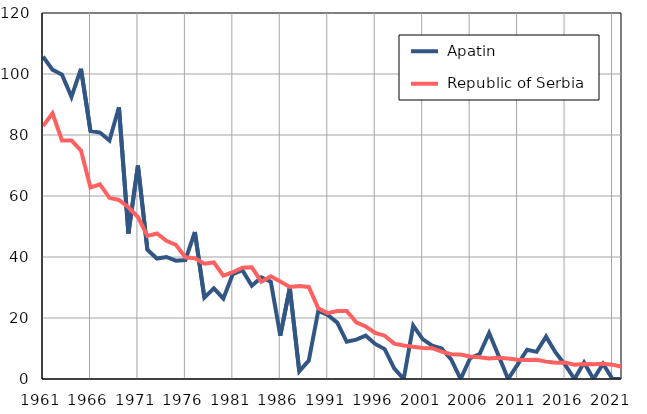
| Category |  Apatin |  Republic of Serbia |
|---|---|---|
| 1961.0 | 105.7 | 82.9 |
| 1962.0 | 101.4 | 87.1 |
| 1963.0 | 99.8 | 78.2 |
| 1964.0 | 92.5 | 78.2 |
| 1965.0 | 101.7 | 74.9 |
| 1966.0 | 81.3 | 62.8 |
| 1967.0 | 80.8 | 63.8 |
| 1968.0 | 78.2 | 59.4 |
| 1969.0 | 89.1 | 58.7 |
| 1970.0 | 47.7 | 56.3 |
| 1971.0 | 70 | 53.1 |
| 1972.0 | 42.4 | 46.9 |
| 1973.0 | 39.5 | 47.7 |
| 1974.0 | 40 | 45.3 |
| 1975.0 | 38.8 | 44 |
| 1976.0 | 39 | 39.9 |
| 1977.0 | 48.2 | 39.6 |
| 1978.0 | 26.7 | 37.8 |
| 1979.0 | 29.7 | 38.2 |
| 1980.0 | 26.4 | 33.9 |
| 1981.0 | 34.4 | 35 |
| 1982.0 | 35.7 | 36.5 |
| 1983.0 | 30.6 | 36.6 |
| 1984.0 | 33.3 | 31.9 |
| 1985.0 | 31.9 | 33.7 |
| 1986.0 | 14.2 | 32 |
| 1987.0 | 29.9 | 30.2 |
| 1988.0 | 2.5 | 30.5 |
| 1989.0 | 6 | 30.2 |
| 1990.0 | 22.3 | 23.2 |
| 1991.0 | 21 | 21.6 |
| 1992.0 | 18.5 | 22.3 |
| 1993.0 | 12.2 | 22.3 |
| 1994.0 | 12.9 | 18.6 |
| 1995.0 | 14.2 | 17.2 |
| 1996.0 | 11.5 | 15.1 |
| 1997.0 | 9.8 | 14.2 |
| 1998.0 | 3.5 | 11.6 |
| 1999.0 | 0 | 11 |
| 2000.0 | 17.5 | 10.6 |
| 2001.0 | 13.1 | 10.2 |
| 2002.0 | 10.9 | 10.1 |
| 2003.0 | 10 | 9 |
| 2004.0 | 6.4 | 8.1 |
| 2005.0 | 0 | 8 |
| 2006.0 | 6.8 | 7.4 |
| 2007.0 | 8.2 | 7.1 |
| 2008.0 | 15.1 | 6.7 |
| 2009.0 | 7.6 | 7 |
| 2010.0 | 0 | 6.7 |
| 2011.0 | 4.7 | 6.3 |
| 2012.0 | 9.6 | 6.2 |
| 2013.0 | 8.9 | 6.3 |
| 2014.0 | 13.9 | 5.7 |
| 2015.0 | 8.7 | 5.3 |
| 2016.0 | 4.7 | 5.4 |
| 2017.0 | 0 | 4.7 |
| 2018.0 | 5.4 | 4.9 |
| 2019.0 | 0 | 4.8 |
| 2020.0 | 5 | 5 |
| 2021.0 | 0 | 4.7 |
| 2022.0 | 0 | 4 |